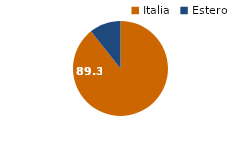
| Category | 2021 |
|---|---|
| Italia | 89.3 |
| Estero | 10.7 |